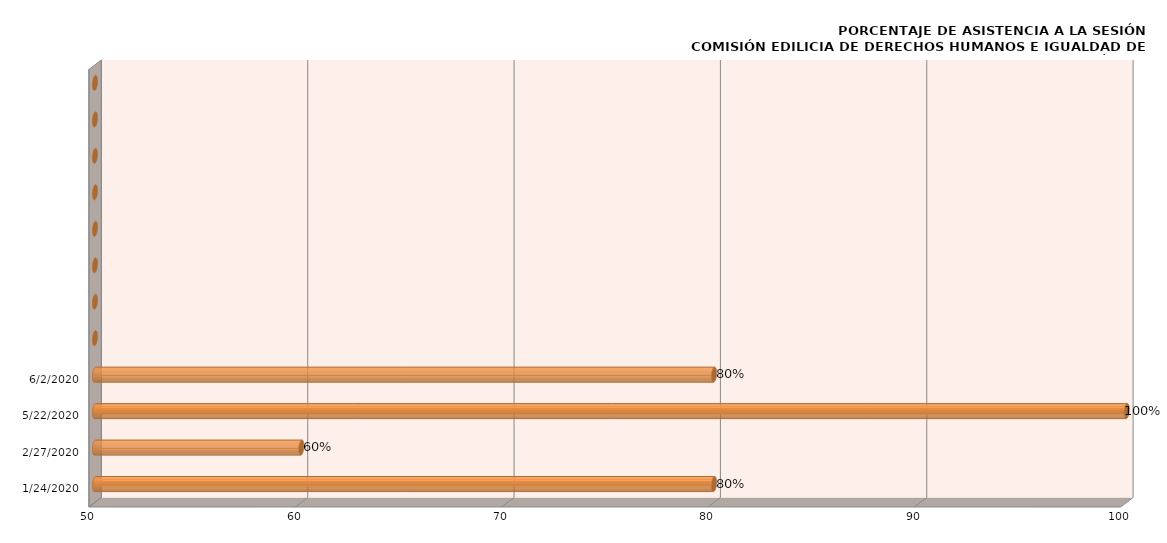
| Category | Series 0 |
|---|---|
| 1/24/20 | 80 |
| 2/27/20 | 60 |
| 5/22/20 | 100 |
| 6/2/20 | 80 |
| nan | 0 |
| nan | 0 |
| nan | 0 |
| nan | 0 |
| nan | 0 |
| nan | 0 |
| nan | 0 |
| nan | 0 |